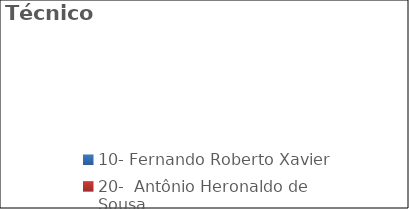
| Category | Técnicos |
|---|---|
| 10- Fernando Roberto Xavier  | 0 |
| 20-  Antônio Heronaldo de Sousa | 0 |